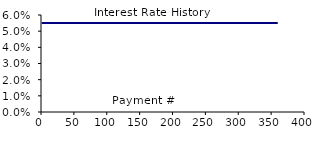
| Category | Interest Rate History |
|---|---|
| 1.0 | 0.055 |
| 2.0 | 0.055 |
| 3.0 | 0.055 |
| 4.0 | 0.055 |
| 5.0 | 0.055 |
| 6.0 | 0.055 |
| 7.0 | 0.055 |
| 8.0 | 0.055 |
| 9.0 | 0.055 |
| 10.0 | 0.055 |
| 11.0 | 0.055 |
| 12.0 | 0.055 |
| 13.0 | 0.055 |
| 14.0 | 0.055 |
| 15.0 | 0.055 |
| 16.0 | 0.055 |
| 17.0 | 0.055 |
| 18.0 | 0.055 |
| 19.0 | 0.055 |
| 20.0 | 0.055 |
| 21.0 | 0.055 |
| 22.0 | 0.055 |
| 23.0 | 0.055 |
| 24.0 | 0.055 |
| 25.0 | 0.055 |
| 26.0 | 0.055 |
| 27.0 | 0.055 |
| 28.0 | 0.055 |
| 29.0 | 0.055 |
| 30.0 | 0.055 |
| 31.0 | 0.055 |
| 32.0 | 0.055 |
| 33.0 | 0.055 |
| 34.0 | 0.055 |
| 35.0 | 0.055 |
| 36.0 | 0.055 |
| 37.0 | 0.055 |
| 38.0 | 0.055 |
| 39.0 | 0.055 |
| 40.0 | 0.055 |
| 41.0 | 0.055 |
| 42.0 | 0.055 |
| 43.0 | 0.055 |
| 44.0 | 0.055 |
| 45.0 | 0.055 |
| 46.0 | 0.055 |
| 47.0 | 0.055 |
| 48.0 | 0.055 |
| 49.0 | 0.055 |
| 50.0 | 0.055 |
| 51.0 | 0.055 |
| 52.0 | 0.055 |
| 53.0 | 0.055 |
| 54.0 | 0.055 |
| 55.0 | 0.055 |
| 56.0 | 0.055 |
| 57.0 | 0.055 |
| 58.0 | 0.055 |
| 59.0 | 0.055 |
| 60.0 | 0.055 |
| 61.0 | 0.055 |
| 62.0 | 0.055 |
| 63.0 | 0.055 |
| 64.0 | 0.055 |
| 65.0 | 0.055 |
| 66.0 | 0.055 |
| 67.0 | 0.055 |
| 68.0 | 0.055 |
| 69.0 | 0.055 |
| 70.0 | 0.055 |
| 71.0 | 0.055 |
| 72.0 | 0.055 |
| 73.0 | 0.055 |
| 74.0 | 0.055 |
| 75.0 | 0.055 |
| 76.0 | 0.055 |
| 77.0 | 0.055 |
| 78.0 | 0.055 |
| 79.0 | 0.055 |
| 80.0 | 0.055 |
| 81.0 | 0.055 |
| 82.0 | 0.055 |
| 83.0 | 0.055 |
| 84.0 | 0.055 |
| 85.0 | 0.055 |
| 86.0 | 0.055 |
| 87.0 | 0.055 |
| 88.0 | 0.055 |
| 89.0 | 0.055 |
| 90.0 | 0.055 |
| 91.0 | 0.055 |
| 92.0 | 0.055 |
| 93.0 | 0.055 |
| 94.0 | 0.055 |
| 95.0 | 0.055 |
| 96.0 | 0.055 |
| 97.0 | 0.055 |
| 98.0 | 0.055 |
| 99.0 | 0.055 |
| 100.0 | 0.055 |
| 101.0 | 0.055 |
| 102.0 | 0.055 |
| 103.0 | 0.055 |
| 104.0 | 0.055 |
| 105.0 | 0.055 |
| 106.0 | 0.055 |
| 107.0 | 0.055 |
| 108.0 | 0.055 |
| 109.0 | 0.055 |
| 110.0 | 0.055 |
| 111.0 | 0.055 |
| 112.0 | 0.055 |
| 113.0 | 0.055 |
| 114.0 | 0.055 |
| 115.0 | 0.055 |
| 116.0 | 0.055 |
| 117.0 | 0.055 |
| 118.0 | 0.055 |
| 119.0 | 0.055 |
| 120.0 | 0.055 |
| 121.0 | 0.055 |
| 122.0 | 0.055 |
| 123.0 | 0.055 |
| 124.0 | 0.055 |
| 125.0 | 0.055 |
| 126.0 | 0.055 |
| 127.0 | 0.055 |
| 128.0 | 0.055 |
| 129.0 | 0.055 |
| 130.0 | 0.055 |
| 131.0 | 0.055 |
| 132.0 | 0.055 |
| 133.0 | 0.055 |
| 134.0 | 0.055 |
| 135.0 | 0.055 |
| 136.0 | 0.055 |
| 137.0 | 0.055 |
| 138.0 | 0.055 |
| 139.0 | 0.055 |
| 140.0 | 0.055 |
| 141.0 | 0.055 |
| 142.0 | 0.055 |
| 143.0 | 0.055 |
| 144.0 | 0.055 |
| 145.0 | 0.055 |
| 146.0 | 0.055 |
| 147.0 | 0.055 |
| 148.0 | 0.055 |
| 149.0 | 0.055 |
| 150.0 | 0.055 |
| 151.0 | 0.055 |
| 152.0 | 0.055 |
| 153.0 | 0.055 |
| 154.0 | 0.055 |
| 155.0 | 0.055 |
| 156.0 | 0.055 |
| 157.0 | 0.055 |
| 158.0 | 0.055 |
| 159.0 | 0.055 |
| 160.0 | 0.055 |
| 161.0 | 0.055 |
| 162.0 | 0.055 |
| 163.0 | 0.055 |
| 164.0 | 0.055 |
| 165.0 | 0.055 |
| 166.0 | 0.055 |
| 167.0 | 0.055 |
| 168.0 | 0.055 |
| 169.0 | 0.055 |
| 170.0 | 0.055 |
| 171.0 | 0.055 |
| 172.0 | 0.055 |
| 173.0 | 0.055 |
| 174.0 | 0.055 |
| 175.0 | 0.055 |
| 176.0 | 0.055 |
| 177.0 | 0.055 |
| 178.0 | 0.055 |
| 179.0 | 0.055 |
| 180.0 | 0.055 |
| 181.0 | 0.055 |
| 182.0 | 0.055 |
| 183.0 | 0.055 |
| 184.0 | 0.055 |
| 185.0 | 0.055 |
| 186.0 | 0.055 |
| 187.0 | 0.055 |
| 188.0 | 0.055 |
| 189.0 | 0.055 |
| 190.0 | 0.055 |
| 191.0 | 0.055 |
| 192.0 | 0.055 |
| 193.0 | 0.055 |
| 194.0 | 0.055 |
| 195.0 | 0.055 |
| 196.0 | 0.055 |
| 197.0 | 0.055 |
| 198.0 | 0.055 |
| 199.0 | 0.055 |
| 200.0 | 0.055 |
| 201.0 | 0.055 |
| 202.0 | 0.055 |
| 203.0 | 0.055 |
| 204.0 | 0.055 |
| 205.0 | 0.055 |
| 206.0 | 0.055 |
| 207.0 | 0.055 |
| 208.0 | 0.055 |
| 209.0 | 0.055 |
| 210.0 | 0.055 |
| 211.0 | 0.055 |
| 212.0 | 0.055 |
| 213.0 | 0.055 |
| 214.0 | 0.055 |
| 215.0 | 0.055 |
| 216.0 | 0.055 |
| 217.0 | 0.055 |
| 218.0 | 0.055 |
| 219.0 | 0.055 |
| 220.0 | 0.055 |
| 221.0 | 0.055 |
| 222.0 | 0.055 |
| 223.0 | 0.055 |
| 224.0 | 0.055 |
| 225.0 | 0.055 |
| 226.0 | 0.055 |
| 227.0 | 0.055 |
| 228.0 | 0.055 |
| 229.0 | 0.055 |
| 230.0 | 0.055 |
| 231.0 | 0.055 |
| 232.0 | 0.055 |
| 233.0 | 0.055 |
| 234.0 | 0.055 |
| 235.0 | 0.055 |
| 236.0 | 0.055 |
| 237.0 | 0.055 |
| 238.0 | 0.055 |
| 239.0 | 0.055 |
| 240.0 | 0.055 |
| 241.0 | 0.055 |
| 242.0 | 0.055 |
| 243.0 | 0.055 |
| 244.0 | 0.055 |
| 245.0 | 0.055 |
| 246.0 | 0.055 |
| 247.0 | 0.055 |
| 248.0 | 0.055 |
| 249.0 | 0.055 |
| 250.0 | 0.055 |
| 251.0 | 0.055 |
| 252.0 | 0.055 |
| 253.0 | 0.055 |
| 254.0 | 0.055 |
| 255.0 | 0.055 |
| 256.0 | 0.055 |
| 257.0 | 0.055 |
| 258.0 | 0.055 |
| 259.0 | 0.055 |
| 260.0 | 0.055 |
| 261.0 | 0.055 |
| 262.0 | 0.055 |
| 263.0 | 0.055 |
| 264.0 | 0.055 |
| 265.0 | 0.055 |
| 266.0 | 0.055 |
| 267.0 | 0.055 |
| 268.0 | 0.055 |
| 269.0 | 0.055 |
| 270.0 | 0.055 |
| 271.0 | 0.055 |
| 272.0 | 0.055 |
| 273.0 | 0.055 |
| 274.0 | 0.055 |
| 275.0 | 0.055 |
| 276.0 | 0.055 |
| 277.0 | 0.055 |
| 278.0 | 0.055 |
| 279.0 | 0.055 |
| 280.0 | 0.055 |
| 281.0 | 0.055 |
| 282.0 | 0.055 |
| 283.0 | 0.055 |
| 284.0 | 0.055 |
| 285.0 | 0.055 |
| 286.0 | 0.055 |
| 287.0 | 0.055 |
| 288.0 | 0.055 |
| 289.0 | 0.055 |
| 290.0 | 0.055 |
| 291.0 | 0.055 |
| 292.0 | 0.055 |
| 293.0 | 0.055 |
| 294.0 | 0.055 |
| 295.0 | 0.055 |
| 296.0 | 0.055 |
| 297.0 | 0.055 |
| 298.0 | 0.055 |
| 299.0 | 0.055 |
| 300.0 | 0.055 |
| 301.0 | 0.055 |
| 302.0 | 0.055 |
| 303.0 | 0.055 |
| 304.0 | 0.055 |
| 305.0 | 0.055 |
| 306.0 | 0.055 |
| 307.0 | 0.055 |
| 308.0 | 0.055 |
| 309.0 | 0.055 |
| 310.0 | 0.055 |
| 311.0 | 0.055 |
| 312.0 | 0.055 |
| 313.0 | 0.055 |
| 314.0 | 0.055 |
| 315.0 | 0.055 |
| 316.0 | 0.055 |
| 317.0 | 0.055 |
| 318.0 | 0.055 |
| 319.0 | 0.055 |
| 320.0 | 0.055 |
| 321.0 | 0.055 |
| 322.0 | 0.055 |
| 323.0 | 0.055 |
| 324.0 | 0.055 |
| 325.0 | 0.055 |
| 326.0 | 0.055 |
| 327.0 | 0.055 |
| 328.0 | 0.055 |
| 329.0 | 0.055 |
| 330.0 | 0.055 |
| 331.0 | 0.055 |
| 332.0 | 0.055 |
| 333.0 | 0.055 |
| 334.0 | 0.055 |
| 335.0 | 0.055 |
| 336.0 | 0.055 |
| 337.0 | 0.055 |
| 338.0 | 0.055 |
| 339.0 | 0.055 |
| 340.0 | 0.055 |
| 341.0 | 0.055 |
| 342.0 | 0.055 |
| 343.0 | 0.055 |
| 344.0 | 0.055 |
| 345.0 | 0.055 |
| 346.0 | 0.055 |
| 347.0 | 0.055 |
| 348.0 | 0.055 |
| 349.0 | 0.055 |
| 350.0 | 0.055 |
| 351.0 | 0.055 |
| 352.0 | 0.055 |
| 353.0 | 0.055 |
| 354.0 | 0.055 |
| 355.0 | 0.055 |
| 356.0 | 0.055 |
| 357.0 | 0.055 |
| 358.0 | 0.055 |
| 359.0 | 0.055 |
| 360.0 | 0.055 |